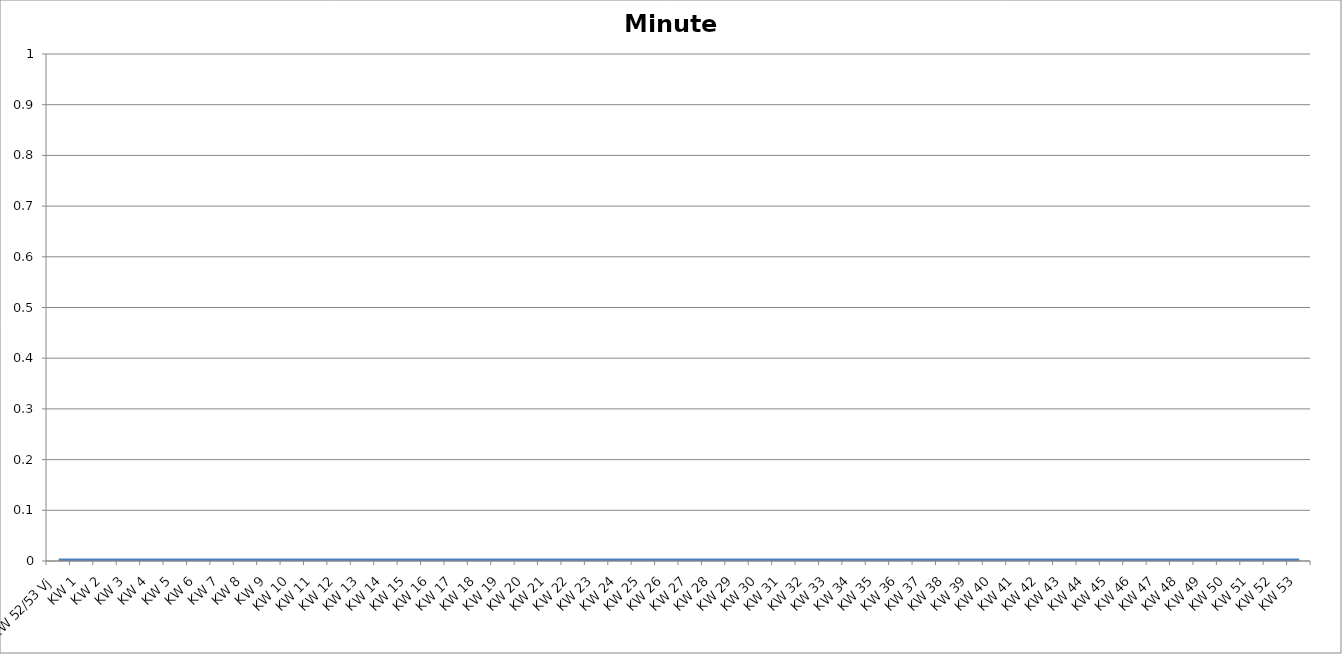
| Category | Minuten |
|---|---|
| KW 52/53 Vj | 0 |
| KW 1 | 0 |
| KW 2 | 0 |
| KW 3 | 0 |
| KW 4 | 0 |
| KW 5 | 0 |
| KW 6 | 0 |
| KW 7 | 0 |
| KW 8 | 0 |
| KW 9 | 0 |
| KW 10 | 0 |
| KW 11 | 0 |
| KW 12 | 0 |
| KW 13 | 0 |
| KW 14 | 0 |
| KW 15 | 0 |
| KW 16 | 0 |
| KW 17 | 0 |
| KW 18 | 0 |
| KW 19 | 0 |
| KW 20 | 0 |
| KW 21 | 0 |
| KW 22 | 0 |
| KW 23 | 0 |
| KW 24 | 0 |
| KW 25 | 0 |
| KW 26 | 0 |
| KW 27 | 0 |
| KW 28 | 0 |
| KW 29 | 0 |
| KW 30 | 0 |
| KW 31 | 0 |
| KW 32 | 0 |
| KW 33 | 0 |
| KW 34 | 0 |
| KW 35 | 0 |
| KW 36 | 0 |
| KW 37 | 0 |
| KW 38 | 0 |
| KW 39 | 0 |
| KW 40 | 0 |
| KW 41 | 0 |
| KW 42 | 0 |
| KW 43 | 0 |
| KW 44 | 0 |
| KW 45 | 0 |
| KW 46 | 0 |
| KW 47 | 0 |
| KW 48 | 0 |
| KW 49 | 0 |
| KW 50 | 0 |
| KW 51 | 0 |
| KW 52 | 0 |
| KW 53 | 0 |